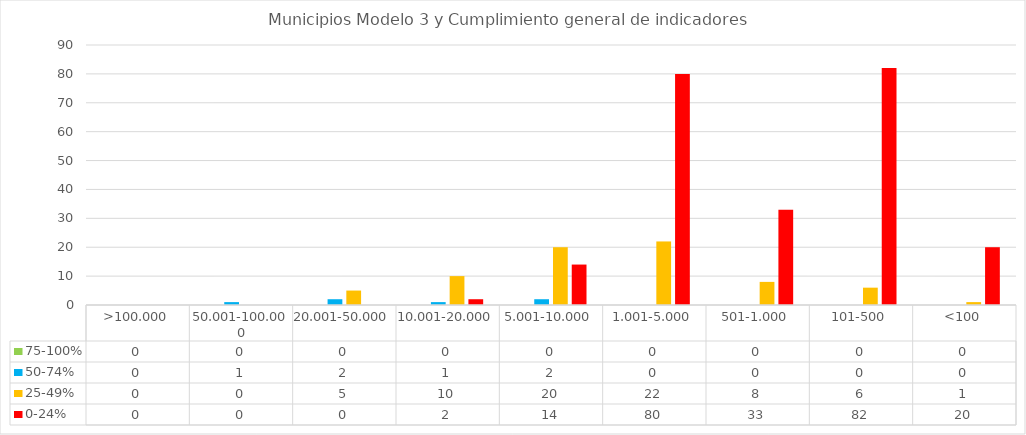
| Category | 75-100% | 50-74% | 25-49% | 0-24% |
|---|---|---|---|---|
| >100.000 | 0 | 0 | 0 | 0 |
| 50.001-100.000 | 0 | 1 | 0 | 0 |
| 20.001-50.000 | 0 | 2 | 5 | 0 |
| 10.001-20.000 | 0 | 1 | 10 | 2 |
| 5.001-10.000 | 0 | 2 | 20 | 14 |
| 1.001-5.000 | 0 | 0 | 22 | 80 |
| 501-1.000 | 0 | 0 | 8 | 33 |
| 101-500 | 0 | 0 | 6 | 82 |
| <100 | 0 | 0 | 1 | 20 |